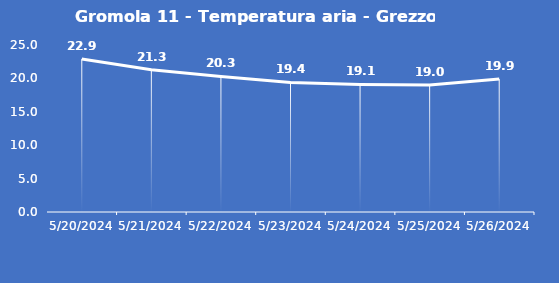
| Category | Gromola 11 - Temperatura aria - Grezzo (°C) |
|---|---|
| 5/20/24 | 22.9 |
| 5/21/24 | 21.3 |
| 5/22/24 | 20.3 |
| 5/23/24 | 19.4 |
| 5/24/24 | 19.1 |
| 5/25/24 | 19 |
| 5/26/24 | 19.9 |